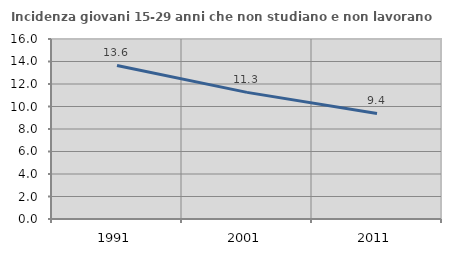
| Category | Incidenza giovani 15-29 anni che non studiano e non lavorano  |
|---|---|
| 1991.0 | 13.648 |
| 2001.0 | 11.254 |
| 2011.0 | 9.378 |